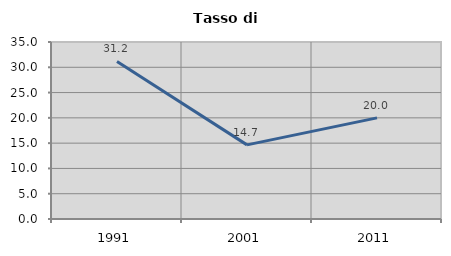
| Category | Tasso di disoccupazione   |
|---|---|
| 1991.0 | 31.165 |
| 2001.0 | 14.655 |
| 2011.0 | 20 |